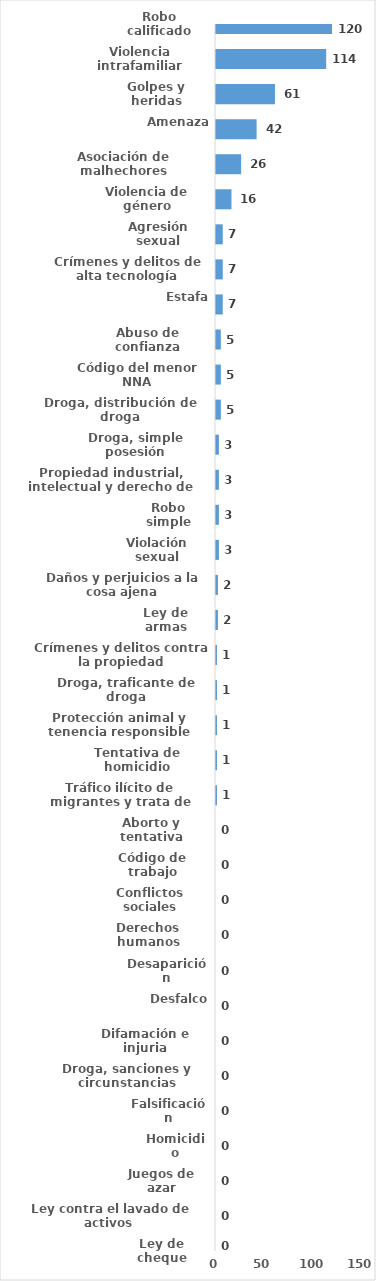
| Category | Series 0 |
|---|---|
| Robo calificado | 120 |
| Violencia intrafamiliar | 114 |
| Golpes y heridas | 61 |
| Amenaza | 42 |
| Asociación de malhechores | 26 |
| Violencia de género | 16 |
| Agresión sexual | 7 |
| Crímenes y delitos de alta tecnología | 7 |
| Estafa | 7 |
| Abuso de confianza | 5 |
| Código del menor NNA | 5 |
| Droga, distribución de droga | 5 |
| Droga, simple posesión | 3 |
| Propiedad industrial, intelectual y derecho de autor | 3 |
| Robo simple | 3 |
| Violación sexual | 3 |
| Daños y perjuicios a la cosa ajena | 2 |
| Ley de armas | 2 |
| Crímenes y delitos contra la propiedad | 1 |
| Droga, traficante de droga | 1 |
| Protección animal y tenencia responsible | 1 |
| Tentativa de homicidio | 1 |
| Tráfico ilícito de migrantes y trata de personas | 1 |
| Aborto y tentativa | 0 |
| Código de trabajo | 0 |
| Conflictos sociales | 0 |
| Derechos humanos | 0 |
| Desaparición | 0 |
| Desfalco | 0 |
| Difamación e injuria | 0 |
| Droga, sanciones y circunstancias agravantes | 0 |
| Falsificación | 0 |
| Homicidio | 0 |
| Juegos de azar | 0 |
| Ley contra el lavado de activos  | 0 |
| Ley de cheque | 0 |